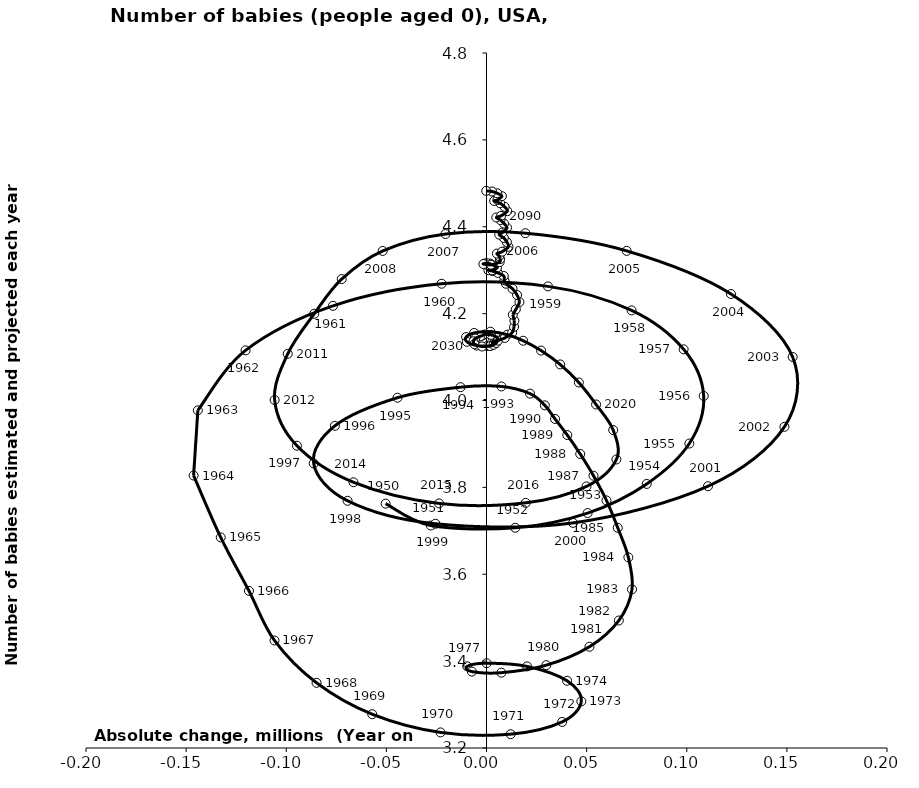
| Category | Series 0 |
|---|---|
| -0.05037899999999995 | 3.763 |
| -0.02780349999999987 | 3.712 |
| 0.014342999999999995 | 3.707 |
| 0.050494999999999735 | 3.741 |
| 0.08000950000000007 | 3.808 |
| 0.10129300000000008 | 3.901 |
| 0.10845900000000008 | 4.011 |
| 0.09844800000000031 | 4.118 |
| 0.07246149999999973 | 4.207 |
| 0.03069249999999979 | 4.263 |
| -0.022400000000000198 | 4.269 |
| -0.07665850000000018 | 4.218 |
| -0.12032099999999968 | 4.115 |
| -0.1441494999999997 | 3.977 |
| -0.146266 | 3.827 |
| -0.13271200000000016 | 3.685 |
| -0.11862499999999998 | 3.562 |
| -0.10587349999999995 | 3.448 |
| -0.08486900000000008 | 3.35 |
| -0.057069999999999954 | 3.278 |
| -0.022971499999999923 | 3.236 |
| 0.012064499999999923 | 3.232 |
| 0.037780499999999995 | 3.26 |
| 0.047355000000000036 | 3.307 |
| 0.040252500000000024 | 3.355 |
| 0.020228499999999983 | 3.388 |
| 4.950000000003563e-05 | 3.395 |
| -0.009642499999999998 | 3.388 |
| -0.0073110000000000674 | 3.376 |
| 0.007409499999999847 | 3.373 |
| 0.029868500000000076 | 3.391 |
| 0.05140950000000011 | 3.433 |
| 0.06609100000000012 | 3.494 |
| 0.07266600000000012 | 3.565 |
| 0.07083999999999979 | 3.639 |
| 0.06554499999999974 | 3.707 |
| 0.05989999999999984 | 3.77 |
| 0.053432000000000146 | 3.827 |
| 0.04680850000000025 | 3.877 |
| 0.04034650000000006 | 3.92 |
| 0.03422999999999998 | 3.958 |
| 0.02912899999999974 | 3.989 |
| 0.021746500000000113 | 4.016 |
| 0.00743500000000008 | 4.032 |
| -0.012955000000000272 | 4.031 |
| -0.04444099999999973 | 4.006 |
| -0.07571099999999986 | 3.942 |
| -0.08630100000000018 | 3.855 |
| -0.06938299999999997 | 3.769 |
| -0.025485999999999898 | 3.716 |
| 0.04322249999999994 | 3.718 |
| 0.11060999999999988 | 3.803 |
| 0.1487909999999999 | 3.939 |
| 0.15288800000000013 | 4.1 |
| 0.1220810000000001 | 4.245 |
| 0.07000399999999996 | 4.344 |
| 0.01940049999999971 | 4.385 |
| -0.02046949999999992 | 4.383 |
| -0.05185199999999979 | 4.344 |
| -0.07230099999999995 | 4.28 |
| -0.08601999999999999 | 4.2 |
| -0.09925200000000034 | 4.107 |
| -0.10579749999999999 | 4.001 |
| -0.09466449999999971 | 3.896 |
| -0.06641999999999992 | 3.812 |
| -0.023697999999999997 | 3.763 |
| 0.019583999999999824 | 3.764 |
| 0.04993000000000003 | 3.802 |
| 0.06487250000000011 | 3.864 |
| 0.06326749999999981 | 3.932 |
| 0.05471849999999989 | 3.991 |
| 0.046117500000000256 | 4.041 |
| 0.03677850000000005 | 4.083 |
| 0.027256999999999643 | 4.115 |
| 0.018296000000000312 | 4.138 |
| 0.010414500000000437 | 4.152 |
| 0.0019489999999997565 | 4.158 |
| -0.006189500000000514 | 4.155 |
| -0.010183499999999679 | 4.146 |
| -0.009763500000000036 | 4.135 |
| -0.004840500000000247 | 4.126 |
| 0.00028650000000007836 | 4.125 |
| 0.0025735000000000063 | 4.127 |
| 0.0035055000000001613 | 4.131 |
| 0.0027974999999997863 | 4.134 |
| 0.00410149999999998 | 4.136 |
| 0.005701500000000248 | 4.142 |
| 0.004432000000000436 | 4.148 |
| 0.002214999999999634 | 4.151 |
| -0.0009175000000003486 | 4.152 |
| -0.0021895000000000664 | 4.149 |
| -0.0032169999999998034 | 4.148 |
| -0.005594499999999503 | 4.143 |
| -0.00650200000000023 | 4.136 |
| -0.0060365 | 4.13 |
| -0.002258499999999941 | 4.124 |
| 0.0018984999999998031 | 4.125 |
| 0.003541999999999934 | 4.128 |
| 0.004858500000000099 | 4.132 |
| 0.005749499999999852 | 4.138 |
| 0.00911850000000003 | 4.144 |
| 0.012805500000000247 | 4.156 |
| 0.01377000000000006 | 4.17 |
| 0.01392799999999994 | 4.184 |
| 0.01314599999999988 | 4.197 |
| 0.014650500000000122 | 4.21 |
| 0.016448499999999644 | 4.227 |
| 0.015267499999999767 | 4.243 |
| 0.012990999999999975 | 4.257 |
| 0.009673000000000265 | 4.269 |
| 0.008968500000000379 | 4.277 |
| 0.008615499999999887 | 4.287 |
| 0.005632999999999999 | 4.294 |
| 0.003025999999999751 | 4.298 |
| 0.0009280000000000399 | 4.3 |
| 0.0028780000000003803 | 4.3 |
| 0.005234999999999879 | 4.306 |
| 0.003918999999999784 | 4.31 |
| 0.001986500000000113 | 4.313 |
| -0.0005895000000002426 | 4.314 |
| 0.0003980000000001205 | 4.312 |
| 0.0018585000000004293 | 4.315 |
| 0.0001714999999999911 | 4.316 |
| -0.0009545000000001913 | 4.315 |
| -0.0015520000000002199 | 4.314 |
| 0.0022895000000002774 | 4.312 |
| 0.006567500000000059 | 4.319 |
| 0.00678899999999949 | 4.325 |
| 0.006378499999999843 | 4.332 |
| 0.005180500000000254 | 4.338 |
| 0.007797000000000054 | 4.343 |
| 0.010978500000000224 | 4.354 |
| 0.010172499999999918 | 4.365 |
| 0.008642499999999664 | 4.374 |
| 0.006352000000000135 | 4.382 |
| 0.00798750000000048 | 4.387 |
| 0.010251500000000302 | 4.398 |
| 0.008743500000000015 | 4.407 |
| 0.007002999999999648 | 4.415 |
| 0.004884499999999292 | 4.421 |
| 0.0072710000000002495 | 4.425 |
| 0.010400500000000257 | 4.436 |
| 0.00904849999999957 | 4.446 |
| 0.00680600000000009 | 4.454 |
| 0.003831000000000362 | 4.459 |
| 0.00548599999999988 | 4.462 |
| 0.0077024999999997235 | 4.47 |
| 0.005369500000000471 | 4.477 |
| 0.0027455000000000673 | 4.481 |
| -0.00013700000000049783 | 4.483 |